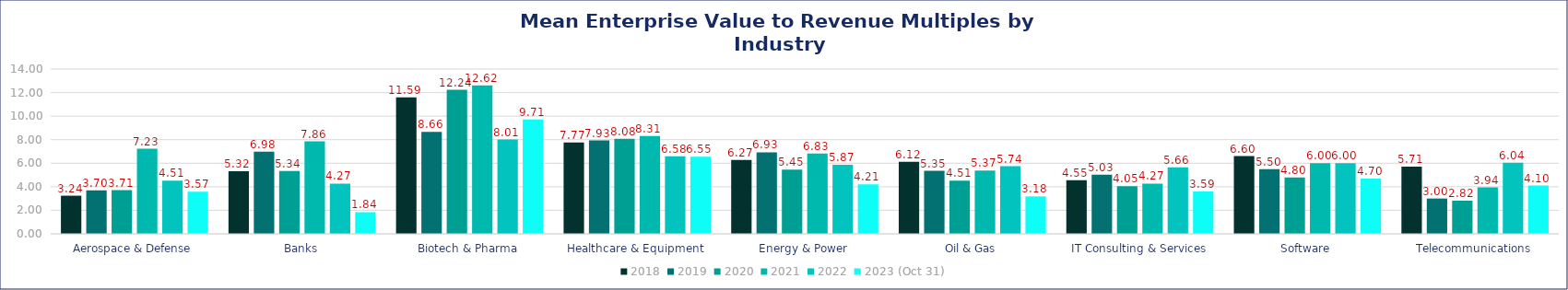
| Category | 2018 | 2019 | 2020 | 2021 | 2022 | 2023 (Oct 31) |
|---|---|---|---|---|---|---|
| Aerospace & Defense | 3.24 | 3.7 | 3.71 | 7.23 | 4.51 | 3.57 |
| Banks | 5.32 | 6.98 | 5.34 | 7.86 | 4.27 | 1.84 |
| Biotech & Pharma | 11.59 | 8.66 | 12.24 | 12.62 | 8.01 | 9.71 |
| Healthcare & Equipment | 7.77 | 7.93 | 8.08 | 8.31 | 6.58 | 6.55 |
| Energy & Power | 6.27 | 6.93 | 5.45 | 6.83 | 5.87 | 4.21 |
| Oil & Gas | 6.12 | 5.35 | 4.51 | 5.37 | 5.74 | 3.18 |
| IT Consulting & Services | 4.55 | 5.03 | 4.05 | 4.27 | 5.66 | 3.59 |
| Software | 6.6 | 5.5 | 4.8 | 6 | 6 | 4.7 |
| Telecommunications | 5.71 | 3 | 2.82 | 3.94 | 6.04 | 4.1 |